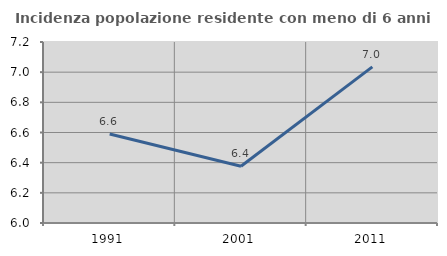
| Category | Incidenza popolazione residente con meno di 6 anni |
|---|---|
| 1991.0 | 6.591 |
| 2001.0 | 6.376 |
| 2011.0 | 7.035 |